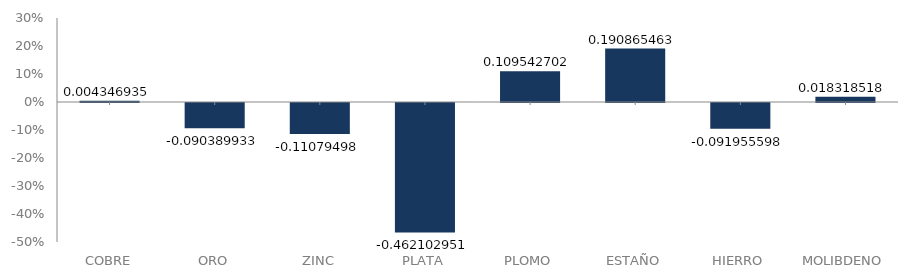
| Category | serie |
|---|---|
| 0 | 0.004 |
| 1 | -0.09 |
| 2 | -0.111 |
| 3 | -0.462 |
| 4 | 0.11 |
| 5 | 0.191 |
| 6 | -0.092 |
| 7 | 0.018 |